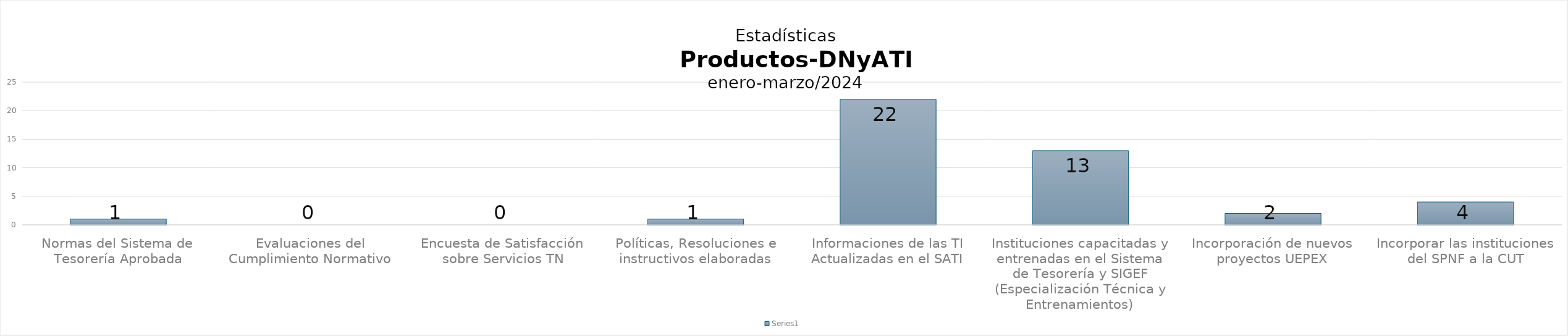
| Category | Series 0 |
|---|---|
| Normas del Sistema de Tesorería Aprobada | 1 |
| Evaluaciones del Cumplimiento Normativo | 0 |
| Encuesta de Satisfacción sobre Servicios TN | 0 |
| Políticas, Resoluciones e instructivos elaboradas | 1 |
| Informaciones de las TI Actualizadas en el SATI | 22 |
| Instituciones capacitadas y entrenadas en el Sistema de Tesorería y SIGEF (Especialización Técnica y Entrenamientos) | 13 |
| Incorporación de nuevos proyectos UEPEX | 2 |
| Incorporar las instituciones del SPNF a la CUT | 4 |